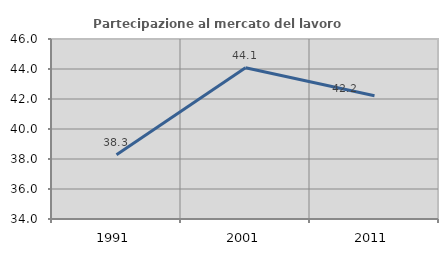
| Category | Partecipazione al mercato del lavoro  femminile |
|---|---|
| 1991.0 | 38.281 |
| 2001.0 | 44.081 |
| 2011.0 | 42.221 |